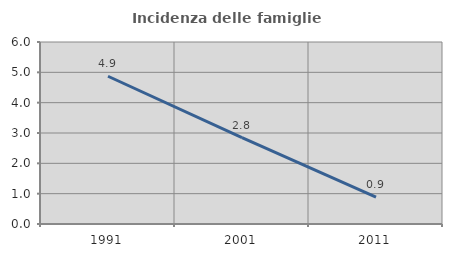
| Category | Incidenza delle famiglie numerose |
|---|---|
| 1991.0 | 4.871 |
| 2001.0 | 2.846 |
| 2011.0 | 0.883 |